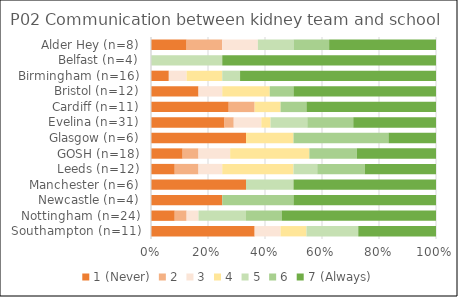
| Category | 1 (Never) | 2 | 3 | 4 | 5 | 6 | 7 (Always) |
|---|---|---|---|---|---|---|---|
| Southampton (n=11) | 4 | 0 | 1 | 1 | 2 | 0 | 3 |
| Nottingham (n=24) | 2 | 1 | 1 | 0 | 4 | 3 | 13 |
| Newcastle (n=4) | 1 | 0 | 0 | 0 | 0 | 1 | 2 |
| Manchester (n=6) | 2 | 0 | 0 | 0 | 1 | 0 | 3 |
| Leeds (n=12) | 1 | 1 | 1 | 3 | 1 | 2 | 3 |
| GOSH (n=18) | 2 | 1 | 2 | 5 | 0 | 3 | 5 |
| Glasgow (n=6) | 2 | 0 | 0 | 1 | 0 | 2 | 1 |
| Evelina (n=31) | 8 | 1 | 3 | 1 | 4 | 5 | 9 |
| Cardiff (n=11) | 3 | 1 | 0 | 1 | 0 | 1 | 5 |
| Bristol (n=12) | 2 | 0 | 1 | 2 | 0 | 1 | 6 |
| Birmingham (n=16) | 1 | 0 | 1 | 2 | 1 | 0 | 11 |
| Belfast (n=4) | 0 | 0 | 0 | 0 | 1 | 0 | 3 |
| Alder Hey (n=8) | 1 | 1 | 1 | 0 | 1 | 1 | 3 |